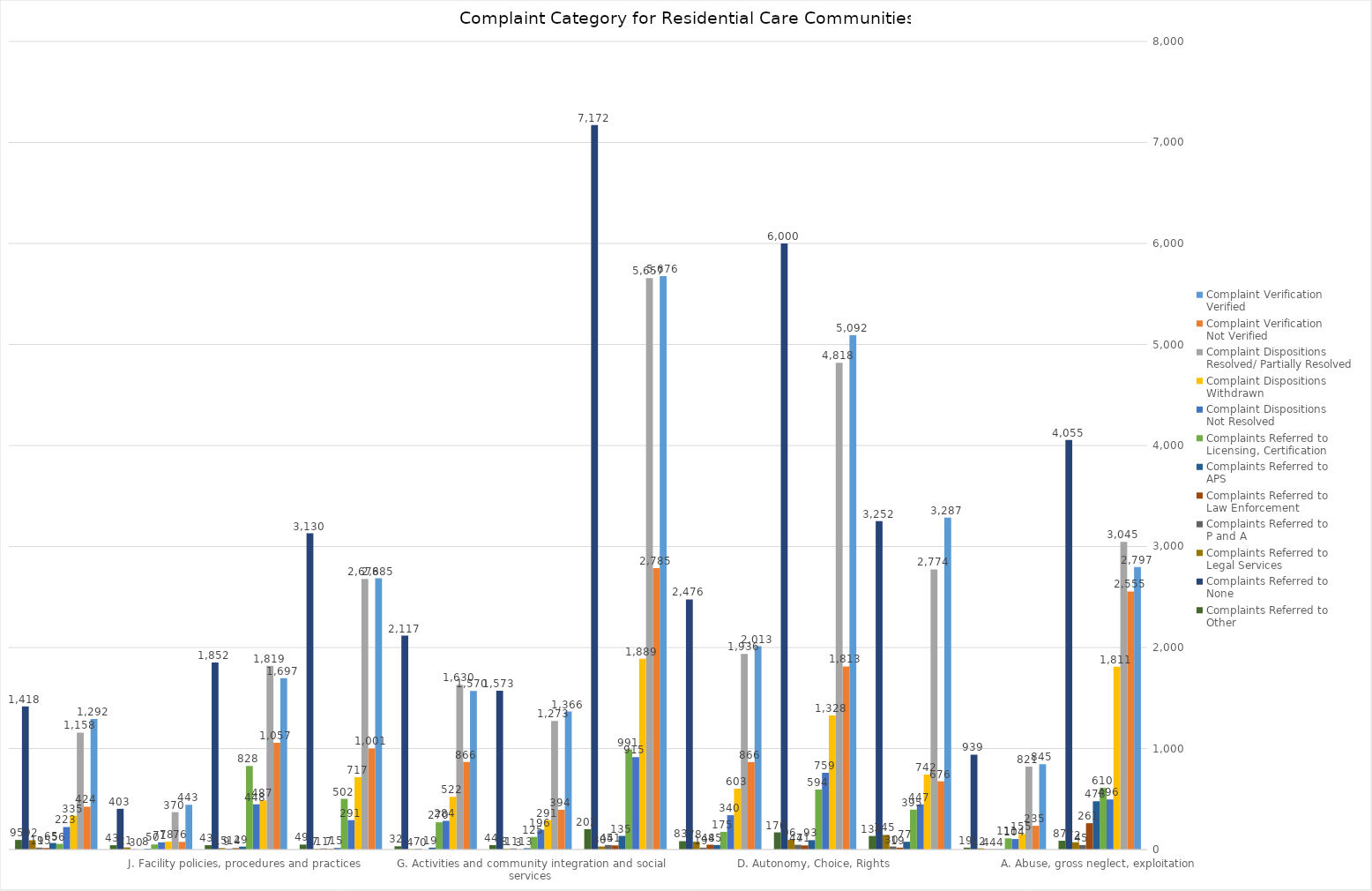
| Category | Complaint Verification
Verified | Complaint Verification 
Not Verified | Complaint Dispositions
Resolved/ Partially Resolved | Complaint Dispositions
Withdrawn | Complaint Dispositions
Not Resolved | Complaints Referred to 
Licensing, Certification  | Complaints Referred to 
APS | Complaints Referred to 
Law Enforcement | Complaints Referred to 
P and A | Complaints Referred to 
Legal Services | Complaints Referred to 
None | Complaints Referred to 
Other |
|---|---|---|---|---|---|---|---|---|---|---|---|---|
| A. Abuse, gross neglect, exploitation | 2797 | 2555 | 3045 | 1811 | 496 | 610 | 478 | 261 | 45 | 72 | 4055 | 87 |
| B. Access to information | 845 | 235 | 821 | 155 | 104 | 111 | 4 | 4 | 4 | 12 | 939 | 19 |
| C. Admission, transfer, discharge, eviction | 3287 | 676 | 2774 | 742 | 447 | 395 | 77 | 19 | 30 | 145 | 3252 | 134 |
| D. Autonomy, Choice, Rights | 5092 | 1813 | 4818 | 1328 | 759 | 594 | 93 | 41 | 47 | 96 | 6000 | 170 |
| E. Financial, Property  | 2013 | 866 | 1936 | 603 | 340 | 175 | 45 | 48 | 19 | 78 | 2476 | 83 |
| F. Care | 5676 | 2785 | 5657 | 1889 | 915 | 991 | 135 | 41 | 45 | 30 | 7172 | 202 |
| G. Activities and community integration and social services | 1366 | 394 | 1273 | 291 | 196 | 125 | 13 | 3 | 11 | 8 | 1573 | 44 |
| H. Dietary | 1570 | 866 | 1630 | 522 | 284 | 270 | 19 | 0 | 7 | 4 | 2117 | 32 |
| I. Environment | 2685 | 1001 | 2678 | 717 | 291 | 502 | 15 | 7 | 11 | 7 | 3130 | 49 |
| J. Facility policies, procedures and practices | 1697 | 1057 | 1819 | 487 | 448 | 828 | 29 | 14 | 9 | 15 | 1852 | 43 |
| K. Complaints about an outside agency (non-facility) | 443 | 76 | 370 | 78 | 71 | 50 | 8 | 0 | 3 | 21 | 403 | 43 |
| L. System and others (non-facility) | 1292 | 424 | 1158 | 335 | 223 | 56 | 65 | 15 | 19 | 92 | 1418 | 95 |